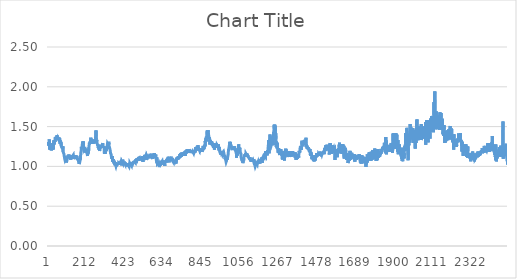
| Category | Series 0 |
|---|---|
| 0 | 1.258 |
| 1 | 1.306 |
| 2 | 1.29 |
| 3 | 1.264 |
| 4 | 1.274 |
| 5 | 1.293 |
| 6 | 1.276 |
| 7 | 1.338 |
| 8 | 1.216 |
| 9 | 1.26 |
| 10 | 1.258 |
| 11 | 1.273 |
| 12 | 1.21 |
| 13 | 1.226 |
| 14 | 1.241 |
| 15 | 1.23 |
| 16 | 1.204 |
| 17 | 1.199 |
| 18 | 1.233 |
| 19 | 1.203 |
| 20 | 1.224 |
| 21 | 1.241 |
| 22 | 1.24 |
| 23 | 1.215 |
| 24 | 1.238 |
| 25 | 1.216 |
| 26 | 1.293 |
| 27 | 1.292 |
| 28 | 1.214 |
| 29 | 1.281 |
| 30 | 1.264 |
| 31 | 1.312 |
| 32 | 1.328 |
| 33 | 1.277 |
| 34 | 1.285 |
| 35 | 1.303 |
| 36 | 1.326 |
| 37 | 1.324 |
| 38 | 1.307 |
| 39 | 1.301 |
| 40 | 1.37 |
| 41 | 1.349 |
| 42 | 1.36 |
| 43 | 1.352 |
| 44 | 1.347 |
| 45 | 1.338 |
| 46 | 1.359 |
| 47 | 1.367 |
| 48 | 1.391 |
| 49 | 1.373 |
| 50 | 1.371 |
| 51 | 1.34 |
| 52 | 1.33 |
| 53 | 1.346 |
| 54 | 1.366 |
| 55 | 1.328 |
| 56 | 1.353 |
| 57 | 1.347 |
| 58 | 1.352 |
| 59 | 1.355 |
| 60 | 1.349 |
| 61 | 1.332 |
| 62 | 1.307 |
| 63 | 1.36 |
| 64 | 1.311 |
| 65 | 1.33 |
| 66 | 1.283 |
| 67 | 1.313 |
| 68 | 1.31 |
| 69 | 1.294 |
| 70 | 1.306 |
| 71 | 1.309 |
| 72 | 1.259 |
| 73 | 1.266 |
| 74 | 1.263 |
| 75 | 1.266 |
| 76 | 1.252 |
| 77 | 1.232 |
| 78 | 1.231 |
| 79 | 1.218 |
| 80 | 1.236 |
| 81 | 1.253 |
| 82 | 1.185 |
| 83 | 1.196 |
| 84 | 1.188 |
| 85 | 1.195 |
| 86 | 1.185 |
| 87 | 1.154 |
| 88 | 1.132 |
| 89 | 1.13 |
| 90 | 1.108 |
| 91 | 1.092 |
| 92 | 1.081 |
| 93 | 1.075 |
| 94 | 1.086 |
| 95 | 1.086 |
| 96 | 1.088 |
| 97 | 1.072 |
| 98 | 1.105 |
| 99 | 1.069 |
| 100 | 1.049 |
| 101 | 1.056 |
| 102 | 1.057 |
| 103 | 1.079 |
| 104 | 1.09 |
| 105 | 1.082 |
| 106 | 1.108 |
| 107 | 1.115 |
| 108 | 1.119 |
| 109 | 1.112 |
| 110 | 1.136 |
| 111 | 1.128 |
| 112 | 1.102 |
| 113 | 1.148 |
| 114 | 1.14 |
| 115 | 1.128 |
| 116 | 1.143 |
| 117 | 1.127 |
| 118 | 1.132 |
| 119 | 1.114 |
| 120 | 1.133 |
| 121 | 1.124 |
| 122 | 1.121 |
| 123 | 1.129 |
| 124 | 1.085 |
| 125 | 1.113 |
| 126 | 1.125 |
| 127 | 1.132 |
| 128 | 1.099 |
| 129 | 1.122 |
| 130 | 1.139 |
| 131 | 1.123 |
| 132 | 1.127 |
| 133 | 1.097 |
| 134 | 1.129 |
| 135 | 1.135 |
| 136 | 1.126 |
| 137 | 1.122 |
| 138 | 1.143 |
| 139 | 1.122 |
| 140 | 1.092 |
| 141 | 1.095 |
| 142 | 1.099 |
| 143 | 1.102 |
| 144 | 1.09 |
| 145 | 1.131 |
| 146 | 1.095 |
| 147 | 1.106 |
| 148 | 1.092 |
| 149 | 1.133 |
| 150 | 1.1 |
| 151 | 1.121 |
| 152 | 1.143 |
| 153 | 1.106 |
| 154 | 1.122 |
| 155 | 1.116 |
| 156 | 1.107 |
| 157 | 1.13 |
| 158 | 1.132 |
| 159 | 1.105 |
| 160 | 1.108 |
| 161 | 1.079 |
| 162 | 1.104 |
| 163 | 1.095 |
| 164 | 1.084 |
| 165 | 1.084 |
| 166 | 1.079 |
| 167 | 1.084 |
| 168 | 1.056 |
| 169 | 1.073 |
| 170 | 1.03 |
| 171 | 1.018 |
| 172 | 1.029 |
| 173 | 1.052 |
| 174 | 1.046 |
| 175 | 1.074 |
| 176 | 1.077 |
| 177 | 1.09 |
| 178 | 1.14 |
| 179 | 1.17 |
| 180 | 1.169 |
| 181 | 1.197 |
| 182 | 1.245 |
| 183 | 1.217 |
| 184 | 1.219 |
| 185 | 1.234 |
| 186 | 1.229 |
| 187 | 1.274 |
| 188 | 1.287 |
| 189 | 1.311 |
| 190 | 1.293 |
| 191 | 1.303 |
| 192 | 1.264 |
| 193 | 1.313 |
| 194 | 1.265 |
| 195 | 1.271 |
| 196 | 1.212 |
| 197 | 1.221 |
| 198 | 1.224 |
| 199 | 1.225 |
| 200 | 1.243 |
| 201 | 1.248 |
| 202 | 1.218 |
| 203 | 1.229 |
| 204 | 1.193 |
| 205 | 1.222 |
| 206 | 1.173 |
| 207 | 1.185 |
| 208 | 1.21 |
| 209 | 1.198 |
| 210 | 1.191 |
| 211 | 1.177 |
| 212 | 1.182 |
| 213 | 1.184 |
| 214 | 1.155 |
| 215 | 1.157 |
| 216 | 1.131 |
| 217 | 1.175 |
| 218 | 1.192 |
| 219 | 1.161 |
| 220 | 1.216 |
| 221 | 1.212 |
| 222 | 1.198 |
| 223 | 1.238 |
| 224 | 1.227 |
| 225 | 1.249 |
| 226 | 1.297 |
| 227 | 1.279 |
| 228 | 1.28 |
| 229 | 1.3 |
| 230 | 1.315 |
| 231 | 1.312 |
| 232 | 1.295 |
| 233 | 1.329 |
| 234 | 1.361 |
| 235 | 1.314 |
| 236 | 1.31 |
| 237 | 1.303 |
| 238 | 1.288 |
| 239 | 1.34 |
| 240 | 1.332 |
| 241 | 1.284 |
| 242 | 1.321 |
| 243 | 1.313 |
| 244 | 1.29 |
| 245 | 1.329 |
| 246 | 1.326 |
| 247 | 1.291 |
| 248 | 1.318 |
| 249 | 1.321 |
| 250 | 1.323 |
| 251 | 1.337 |
| 252 | 1.311 |
| 253 | 1.325 |
| 254 | 1.325 |
| 255 | 1.331 |
| 256 | 1.332 |
| 257 | 1.318 |
| 258 | 1.29 |
| 259 | 1.344 |
| 260 | 1.331 |
| 261 | 1.305 |
| 262 | 1.45 |
| 263 | 1.343 |
| 264 | 1.318 |
| 265 | 1.293 |
| 266 | 1.334 |
| 267 | 1.308 |
| 268 | 1.291 |
| 269 | 1.281 |
| 270 | 1.278 |
| 271 | 1.288 |
| 272 | 1.278 |
| 273 | 1.258 |
| 274 | 1.273 |
| 275 | 1.233 |
| 276 | 1.266 |
| 277 | 1.228 |
| 278 | 1.21 |
| 279 | 1.22 |
| 280 | 1.242 |
| 281 | 1.223 |
| 282 | 1.193 |
| 283 | 1.215 |
| 284 | 1.207 |
| 285 | 1.227 |
| 286 | 1.204 |
| 287 | 1.232 |
| 288 | 1.229 |
| 289 | 1.271 |
| 290 | 1.235 |
| 291 | 1.259 |
| 292 | 1.269 |
| 293 | 1.246 |
| 294 | 1.268 |
| 295 | 1.242 |
| 296 | 1.272 |
| 297 | 1.271 |
| 298 | 1.279 |
| 299 | 1.293 |
| 300 | 1.277 |
| 301 | 1.278 |
| 302 | 1.276 |
| 303 | 1.231 |
| 304 | 1.239 |
| 305 | 1.253 |
| 306 | 1.244 |
| 307 | 1.235 |
| 308 | 1.16 |
| 309 | 1.209 |
| 310 | 1.224 |
| 311 | 1.183 |
| 312 | 1.156 |
| 313 | 1.205 |
| 314 | 1.179 |
| 315 | 1.183 |
| 316 | 1.199 |
| 317 | 1.188 |
| 318 | 1.232 |
| 319 | 1.197 |
| 320 | 1.247 |
| 321 | 1.24 |
| 322 | 1.222 |
| 323 | 1.245 |
| 324 | 1.257 |
| 325 | 1.285 |
| 326 | 1.279 |
| 327 | 1.293 |
| 328 | 1.272 |
| 329 | 1.3 |
| 330 | 1.244 |
| 331 | 1.258 |
| 332 | 1.31 |
| 333 | 1.281 |
| 334 | 1.255 |
| 335 | 1.266 |
| 336 | 1.25 |
| 337 | 1.26 |
| 338 | 1.25 |
| 339 | 1.211 |
| 340 | 1.22 |
| 341 | 1.211 |
| 342 | 1.165 |
| 343 | 1.167 |
| 344 | 1.158 |
| 345 | 1.149 |
| 346 | 1.156 |
| 347 | 1.114 |
| 348 | 1.129 |
| 349 | 1.097 |
| 350 | 1.091 |
| 351 | 1.131 |
| 352 | 1.081 |
| 353 | 1.087 |
| 354 | 1.058 |
| 355 | 1.077 |
| 356 | 1.06 |
| 357 | 1.089 |
| 358 | 1.073 |
| 359 | 1.051 |
| 360 | 1.07 |
| 361 | 1.039 |
| 362 | 1.069 |
| 363 | 1.05 |
| 364 | 1.034 |
| 365 | 1.026 |
| 366 | 1.015 |
| 367 | 1.055 |
| 368 | 1.026 |
| 369 | 1.028 |
| 370 | 1.015 |
| 371 | 1.004 |
| 372 | 1.01 |
| 373 | 0.997 |
| 374 | 1.033 |
| 375 | 1.01 |
| 376 | 0.999 |
| 377 | 0.998 |
| 378 | 1.009 |
| 379 | 1.001 |
| 380 | 1.009 |
| 381 | 1.027 |
| 382 | 1.026 |
| 383 | 1.031 |
| 384 | 1.043 |
| 385 | 1.021 |
| 386 | 1.044 |
| 387 | 1.041 |
| 388 | 1.045 |
| 389 | 1.042 |
| 390 | 1.04 |
| 391 | 1.044 |
| 392 | 1.033 |
| 393 | 1.019 |
| 394 | 1.049 |
| 395 | 1.053 |
| 396 | 1.04 |
| 397 | 1.039 |
| 398 | 1.063 |
| 399 | 1.043 |
| 400 | 1.021 |
| 401 | 1.041 |
| 402 | 1.043 |
| 403 | 1.013 |
| 404 | 1.059 |
| 405 | 1.064 |
| 406 | 1.049 |
| 407 | 1.055 |
| 408 | 1.043 |
| 409 | 1.085 |
| 410 | 1.029 |
| 411 | 1.051 |
| 412 | 1.048 |
| 413 | 1.036 |
| 414 | 1.022 |
| 415 | 1.045 |
| 416 | 1.026 |
| 417 | 1.058 |
| 418 | 1.058 |
| 419 | 1.041 |
| 420 | 1.031 |
| 421 | 1.035 |
| 422 | 1.027 |
| 423 | 1.047 |
| 424 | 1.035 |
| 425 | 1.044 |
| 426 | 1.02 |
| 427 | 1.039 |
| 428 | 1.029 |
| 429 | 1 |
| 430 | 1.025 |
| 431 | 1.01 |
| 432 | 1.04 |
| 433 | 1.036 |
| 434 | 1.031 |
| 435 | 1.014 |
| 436 | 1.036 |
| 437 | 1.032 |
| 438 | 1.027 |
| 439 | 1.012 |
| 440 | 1.009 |
| 441 | 1.021 |
| 442 | 1.013 |
| 443 | 0.997 |
| 444 | 1 |
| 445 | 1.024 |
| 446 | 1.01 |
| 447 | 1.041 |
| 448 | 1.031 |
| 449 | 1.05 |
| 450 | 1.027 |
| 451 | 1.023 |
| 452 | 1.039 |
| 453 | 1.021 |
| 454 | 1.035 |
| 455 | 1.01 |
| 456 | 1.04 |
| 457 | 1.055 |
| 458 | 1.05 |
| 459 | 1.047 |
| 460 | 1.033 |
| 461 | 1.031 |
| 462 | 1.054 |
| 463 | 1.056 |
| 464 | 1.036 |
| 465 | 1.042 |
| 466 | 1.042 |
| 467 | 1.054 |
| 468 | 1.042 |
| 469 | 1.051 |
| 470 | 1.043 |
| 471 | 1.056 |
| 472 | 1.065 |
| 473 | 1.062 |
| 474 | 1.051 |
| 475 | 1.072 |
| 476 | 1.05 |
| 477 | 1.066 |
| 478 | 1.047 |
| 479 | 1.064 |
| 480 | 1.087 |
| 481 | 1.046 |
| 482 | 1.088 |
| 483 | 1.098 |
| 484 | 1.069 |
| 485 | 1.084 |
| 486 | 1.104 |
| 487 | 1.097 |
| 488 | 1.089 |
| 489 | 1.089 |
| 490 | 1.103 |
| 491 | 1.083 |
| 492 | 1.09 |
| 493 | 1.099 |
| 494 | 1.068 |
| 495 | 1.106 |
| 496 | 1.112 |
| 497 | 1.096 |
| 498 | 1.102 |
| 499 | 1.109 |
| 500 | 1.109 |
| 501 | 1.113 |
| 502 | 1.124 |
| 503 | 1.107 |
| 504 | 1.096 |
| 505 | 1.077 |
| 506 | 1.093 |
| 507 | 1.109 |
| 508 | 1.113 |
| 509 | 1.096 |
| 510 | 1.095 |
| 511 | 1.099 |
| 512 | 1.076 |
| 513 | 1.086 |
| 514 | 1.11 |
| 515 | 1.096 |
| 516 | 1.08 |
| 517 | 1.129 |
| 518 | 1.105 |
| 519 | 1.056 |
| 520 | 1.108 |
| 521 | 1.112 |
| 522 | 1.094 |
| 523 | 1.08 |
| 524 | 1.075 |
| 525 | 1.079 |
| 526 | 1.073 |
| 527 | 1.115 |
| 528 | 1.145 |
| 529 | 1.107 |
| 530 | 1.105 |
| 531 | 1.102 |
| 532 | 1.119 |
| 533 | 1.116 |
| 534 | 1.132 |
| 535 | 1.114 |
| 536 | 1.088 |
| 537 | 1.125 |
| 538 | 1.106 |
| 539 | 1.127 |
| 540 | 1.085 |
| 541 | 1.133 |
| 542 | 1.129 |
| 543 | 1.122 |
| 544 | 1.12 |
| 545 | 1.13 |
| 546 | 1.122 |
| 547 | 1.142 |
| 548 | 1.119 |
| 549 | 1.132 |
| 550 | 1.113 |
| 551 | 1.142 |
| 552 | 1.148 |
| 553 | 1.135 |
| 554 | 1.109 |
| 555 | 1.131 |
| 556 | 1.127 |
| 557 | 1.102 |
| 558 | 1.158 |
| 559 | 1.147 |
| 560 | 1.145 |
| 561 | 1.127 |
| 562 | 1.142 |
| 563 | 1.124 |
| 564 | 1.14 |
| 565 | 1.131 |
| 566 | 1.127 |
| 567 | 1.118 |
| 568 | 1.121 |
| 569 | 1.118 |
| 570 | 1.132 |
| 571 | 1.137 |
| 572 | 1.092 |
| 573 | 1.151 |
| 574 | 1.136 |
| 575 | 1.118 |
| 576 | 1.14 |
| 577 | 1.109 |
| 578 | 1.141 |
| 579 | 1.16 |
| 580 | 1.14 |
| 581 | 1.166 |
| 582 | 1.161 |
| 583 | 1.131 |
| 584 | 1.122 |
| 585 | 1.135 |
| 586 | 1.104 |
| 587 | 1.1 |
| 588 | 1.111 |
| 589 | 1.148 |
| 590 | 1.11 |
| 591 | 1.12 |
| 592 | 1.09 |
| 593 | 1.061 |
| 594 | 1.06 |
| 595 | 1.114 |
| 596 | 1.042 |
| 597 | 1.055 |
| 598 | 1.032 |
| 599 | 1.03 |
| 600 | 1.026 |
| 601 | 1.034 |
| 602 | 1.034 |
| 603 | 1.025 |
| 604 | 1.047 |
| 605 | 1.016 |
| 606 | 1.03 |
| 607 | 1.015 |
| 608 | 1.012 |
| 609 | 0.991 |
| 610 | 1.001 |
| 611 | 1.027 |
| 612 | 1.021 |
| 613 | 1.008 |
| 614 | 1.031 |
| 615 | 1.021 |
| 616 | 1.027 |
| 617 | 1.05 |
| 618 | 1.021 |
| 619 | 1.07 |
| 620 | 1.052 |
| 621 | 1.043 |
| 622 | 1.059 |
| 623 | 1.042 |
| 624 | 1.066 |
| 625 | 1.051 |
| 626 | 1.071 |
| 627 | 1.054 |
| 628 | 1.067 |
| 629 | 1.075 |
| 630 | 1.026 |
| 631 | 1.043 |
| 632 | 1.074 |
| 633 | 1.033 |
| 634 | 1.029 |
| 635 | 1.032 |
| 636 | 1.032 |
| 637 | 1.057 |
| 638 | 1.007 |
| 639 | 1.035 |
| 640 | 1.039 |
| 641 | 1.052 |
| 642 | 1.05 |
| 643 | 1.058 |
| 644 | 1.049 |
| 645 | 1.061 |
| 646 | 1.05 |
| 647 | 1.075 |
| 648 | 1.053 |
| 649 | 1.068 |
| 650 | 1.084 |
| 651 | 1.068 |
| 652 | 1.069 |
| 653 | 1.052 |
| 654 | 1.095 |
| 655 | 1.079 |
| 656 | 1.068 |
| 657 | 1.09 |
| 658 | 1.106 |
| 659 | 1.111 |
| 660 | 1.084 |
| 661 | 1.12 |
| 662 | 1.051 |
| 663 | 1.097 |
| 664 | 1.101 |
| 665 | 1.118 |
| 666 | 1.101 |
| 667 | 1.104 |
| 668 | 1.086 |
| 669 | 1.093 |
| 670 | 1.106 |
| 671 | 1.07 |
| 672 | 1.121 |
| 673 | 1.113 |
| 674 | 1.088 |
| 675 | 1.094 |
| 676 | 1.105 |
| 677 | 1.075 |
| 678 | 1.083 |
| 679 | 1.1 |
| 680 | 1.098 |
| 681 | 1.088 |
| 682 | 1.064 |
| 683 | 1.069 |
| 684 | 1.072 |
| 685 | 1.072 |
| 686 | 1.055 |
| 687 | 1.047 |
| 688 | 1.054 |
| 689 | 1.071 |
| 690 | 1.065 |
| 691 | 1.063 |
| 692 | 1.071 |
| 693 | 1.064 |
| 694 | 1.057 |
| 695 | 1.068 |
| 696 | 1.046 |
| 697 | 1.077 |
| 698 | 1.087 |
| 699 | 1.085 |
| 700 | 1.036 |
| 701 | 1.068 |
| 702 | 1.09 |
| 703 | 1.071 |
| 704 | 1.107 |
| 705 | 1.09 |
| 706 | 1.11 |
| 707 | 1.088 |
| 708 | 1.093 |
| 709 | 1.103 |
| 710 | 1.089 |
| 711 | 1.096 |
| 712 | 1.126 |
| 713 | 1.121 |
| 714 | 1.092 |
| 715 | 1.097 |
| 716 | 1.109 |
| 717 | 1.127 |
| 718 | 1.106 |
| 719 | 1.123 |
| 720 | 1.129 |
| 721 | 1.153 |
| 722 | 1.129 |
| 723 | 1.126 |
| 724 | 1.116 |
| 725 | 1.15 |
| 726 | 1.168 |
| 727 | 1.121 |
| 728 | 1.155 |
| 729 | 1.144 |
| 730 | 1.12 |
| 731 | 1.161 |
| 732 | 1.176 |
| 733 | 1.145 |
| 734 | 1.157 |
| 735 | 1.157 |
| 736 | 1.147 |
| 737 | 1.148 |
| 738 | 1.138 |
| 739 | 1.16 |
| 740 | 1.132 |
| 741 | 1.159 |
| 742 | 1.162 |
| 743 | 1.14 |
| 744 | 1.158 |
| 745 | 1.144 |
| 746 | 1.162 |
| 747 | 1.163 |
| 748 | 1.178 |
| 749 | 1.167 |
| 750 | 1.133 |
| 751 | 1.167 |
| 752 | 1.182 |
| 753 | 1.199 |
| 754 | 1.185 |
| 755 | 1.187 |
| 756 | 1.164 |
| 757 | 1.169 |
| 758 | 1.179 |
| 759 | 1.211 |
| 760 | 1.19 |
| 761 | 1.202 |
| 762 | 1.187 |
| 763 | 1.212 |
| 764 | 1.197 |
| 765 | 1.196 |
| 766 | 1.189 |
| 767 | 1.169 |
| 768 | 1.208 |
| 769 | 1.199 |
| 770 | 1.188 |
| 771 | 1.213 |
| 772 | 1.202 |
| 773 | 1.221 |
| 774 | 1.209 |
| 775 | 1.191 |
| 776 | 1.19 |
| 777 | 1.186 |
| 778 | 1.17 |
| 779 | 1.179 |
| 780 | 1.195 |
| 781 | 1.174 |
| 782 | 1.183 |
| 783 | 1.182 |
| 784 | 1.185 |
| 785 | 1.181 |
| 786 | 1.186 |
| 787 | 1.206 |
| 788 | 1.166 |
| 789 | 1.172 |
| 790 | 1.174 |
| 791 | 1.162 |
| 792 | 1.188 |
| 793 | 1.183 |
| 794 | 1.191 |
| 795 | 1.174 |
| 796 | 1.191 |
| 797 | 1.17 |
| 798 | 1.2 |
| 799 | 1.191 |
| 800 | 1.19 |
| 801 | 1.182 |
| 802 | 1.194 |
| 803 | 1.184 |
| 804 | 1.196 |
| 805 | 1.177 |
| 806 | 1.207 |
| 807 | 1.214 |
| 808 | 1.243 |
| 809 | 1.202 |
| 810 | 1.219 |
| 811 | 1.219 |
| 812 | 1.211 |
| 813 | 1.237 |
| 814 | 1.202 |
| 815 | 1.224 |
| 816 | 1.241 |
| 817 | 1.218 |
| 818 | 1.203 |
| 819 | 1.251 |
| 820 | 1.267 |
| 821 | 1.219 |
| 822 | 1.245 |
| 823 | 1.231 |
| 824 | 1.223 |
| 825 | 1.221 |
| 826 | 1.237 |
| 827 | 1.224 |
| 828 | 1.206 |
| 829 | 1.227 |
| 830 | 1.237 |
| 831 | 1.209 |
| 832 | 1.195 |
| 833 | 1.207 |
| 834 | 1.201 |
| 835 | 1.186 |
| 836 | 1.208 |
| 837 | 1.223 |
| 838 | 1.209 |
| 839 | 1.189 |
| 840 | 1.216 |
| 841 | 1.229 |
| 842 | 1.205 |
| 843 | 1.181 |
| 844 | 1.186 |
| 845 | 1.223 |
| 846 | 1.202 |
| 847 | 1.202 |
| 848 | 1.209 |
| 849 | 1.257 |
| 850 | 1.268 |
| 851 | 1.213 |
| 852 | 1.239 |
| 853 | 1.234 |
| 854 | 1.225 |
| 855 | 1.238 |
| 856 | 1.248 |
| 857 | 1.273 |
| 858 | 1.263 |
| 859 | 1.251 |
| 860 | 1.32 |
| 861 | 1.294 |
| 862 | 1.3 |
| 863 | 1.328 |
| 864 | 1.355 |
| 865 | 1.315 |
| 866 | 1.371 |
| 867 | 1.359 |
| 868 | 1.356 |
| 869 | 1.358 |
| 870 | 1.356 |
| 871 | 1.449 |
| 872 | 1.395 |
| 873 | 1.393 |
| 874 | 1.402 |
| 875 | 1.455 |
| 876 | 1.446 |
| 877 | 1.427 |
| 878 | 1.402 |
| 879 | 1.395 |
| 880 | 1.372 |
| 881 | 1.379 |
| 882 | 1.34 |
| 883 | 1.364 |
| 884 | 1.343 |
| 885 | 1.276 |
| 886 | 1.332 |
| 887 | 1.307 |
| 888 | 1.323 |
| 889 | 1.312 |
| 890 | 1.322 |
| 891 | 1.289 |
| 892 | 1.314 |
| 893 | 1.319 |
| 894 | 1.296 |
| 895 | 1.303 |
| 896 | 1.313 |
| 897 | 1.267 |
| 898 | 1.29 |
| 899 | 1.277 |
| 900 | 1.256 |
| 901 | 1.248 |
| 902 | 1.276 |
| 903 | 1.276 |
| 904 | 1.265 |
| 905 | 1.234 |
| 906 | 1.253 |
| 907 | 1.29 |
| 908 | 1.246 |
| 909 | 1.254 |
| 910 | 1.21 |
| 911 | 1.226 |
| 912 | 1.27 |
| 913 | 1.234 |
| 914 | 1.26 |
| 915 | 1.246 |
| 916 | 1.231 |
| 917 | 1.263 |
| 918 | 1.282 |
| 919 | 1.257 |
| 920 | 1.287 |
| 921 | 1.279 |
| 922 | 1.245 |
| 923 | 1.265 |
| 924 | 1.232 |
| 925 | 1.267 |
| 926 | 1.272 |
| 927 | 1.267 |
| 928 | 1.266 |
| 929 | 1.277 |
| 930 | 1.248 |
| 931 | 1.26 |
| 932 | 1.277 |
| 933 | 1.261 |
| 934 | 1.257 |
| 935 | 1.2 |
| 936 | 1.238 |
| 937 | 1.217 |
| 938 | 1.236 |
| 939 | 1.188 |
| 940 | 1.187 |
| 941 | 1.185 |
| 942 | 1.167 |
| 943 | 1.156 |
| 944 | 1.153 |
| 945 | 1.183 |
| 946 | 1.159 |
| 947 | 1.145 |
| 948 | 1.135 |
| 949 | 1.149 |
| 950 | 1.193 |
| 951 | 1.163 |
| 952 | 1.162 |
| 953 | 1.167 |
| 954 | 1.157 |
| 955 | 1.164 |
| 956 | 1.177 |
| 957 | 1.155 |
| 958 | 1.162 |
| 959 | 1.156 |
| 960 | 1.153 |
| 961 | 1.173 |
| 962 | 1.161 |
| 963 | 1.151 |
| 964 | 1.12 |
| 965 | 1.121 |
| 966 | 1.144 |
| 967 | 1.125 |
| 968 | 1.092 |
| 969 | 1.104 |
| 970 | 1.112 |
| 971 | 1.087 |
| 972 | 1.078 |
| 973 | 1.086 |
| 974 | 1.056 |
| 975 | 1.06 |
| 976 | 1.069 |
| 977 | 1.08 |
| 978 | 1.06 |
| 979 | 1.123 |
| 980 | 1.086 |
| 981 | 1.09 |
| 982 | 1.108 |
| 983 | 1.116 |
| 984 | 1.109 |
| 985 | 1.146 |
| 986 | 1.166 |
| 987 | 1.209 |
| 988 | 1.205 |
| 989 | 1.208 |
| 990 | 1.232 |
| 991 | 1.254 |
| 992 | 1.243 |
| 993 | 1.277 |
| 994 | 1.31 |
| 995 | 1.306 |
| 996 | 1.272 |
| 997 | 1.306 |
| 998 | 1.282 |
| 999 | 1.272 |
| 1000 | 1.29 |
| 1001 | 1.286 |
| 1002 | 1.262 |
| 1003 | 1.237 |
| 1004 | 1.241 |
| 1005 | 1.248 |
| 1006 | 1.229 |
| 1007 | 1.205 |
| 1008 | 1.224 |
| 1009 | 1.215 |
| 1010 | 1.208 |
| 1011 | 1.24 |
| 1012 | 1.246 |
| 1013 | 1.231 |
| 1014 | 1.215 |
| 1015 | 1.249 |
| 1016 | 1.22 |
| 1017 | 1.217 |
| 1018 | 1.223 |
| 1019 | 1.252 |
| 1020 | 1.236 |
| 1021 | 1.246 |
| 1022 | 1.209 |
| 1023 | 1.228 |
| 1024 | 1.208 |
| 1025 | 1.201 |
| 1026 | 1.2 |
| 1027 | 1.217 |
| 1028 | 1.189 |
| 1029 | 1.206 |
| 1030 | 1.173 |
| 1031 | 1.11 |
| 1032 | 1.204 |
| 1033 | 1.192 |
| 1034 | 1.189 |
| 1035 | 1.135 |
| 1036 | 1.178 |
| 1037 | 1.189 |
| 1038 | 1.185 |
| 1039 | 1.199 |
| 1040 | 1.235 |
| 1041 | 1.226 |
| 1042 | 1.224 |
| 1043 | 1.277 |
| 1044 | 1.233 |
| 1045 | 1.235 |
| 1046 | 1.223 |
| 1047 | 1.214 |
| 1048 | 1.221 |
| 1049 | 1.236 |
| 1050 | 1.211 |
| 1051 | 1.198 |
| 1052 | 1.175 |
| 1053 | 1.184 |
| 1054 | 1.175 |
| 1055 | 1.16 |
| 1056 | 1.117 |
| 1057 | 1.129 |
| 1058 | 1.107 |
| 1059 | 1.089 |
| 1060 | 1.107 |
| 1061 | 1.081 |
| 1062 | 1.064 |
| 1063 | 1.08 |
| 1064 | 1.077 |
| 1065 | 1.062 |
| 1066 | 1.041 |
| 1067 | 1.042 |
| 1068 | 1.07 |
| 1069 | 1.094 |
| 1070 | 1.076 |
| 1071 | 1.108 |
| 1072 | 1.109 |
| 1073 | 1.108 |
| 1074 | 1.148 |
| 1075 | 1.124 |
| 1076 | 1.126 |
| 1077 | 1.135 |
| 1078 | 1.144 |
| 1079 | 1.127 |
| 1080 | 1.163 |
| 1081 | 1.131 |
| 1082 | 1.161 |
| 1083 | 1.159 |
| 1084 | 1.153 |
| 1085 | 1.148 |
| 1086 | 1.13 |
| 1087 | 1.164 |
| 1088 | 1.167 |
| 1089 | 1.139 |
| 1090 | 1.152 |
| 1091 | 1.145 |
| 1092 | 1.123 |
| 1093 | 1.138 |
| 1094 | 1.128 |
| 1095 | 1.119 |
| 1096 | 1.11 |
| 1097 | 1.124 |
| 1098 | 1.109 |
| 1099 | 1.131 |
| 1100 | 1.113 |
| 1101 | 1.1 |
| 1102 | 1.094 |
| 1103 | 1.087 |
| 1104 | 1.116 |
| 1105 | 1.098 |
| 1106 | 1.095 |
| 1107 | 1.097 |
| 1108 | 1.065 |
| 1109 | 1.081 |
| 1110 | 1.093 |
| 1111 | 1.092 |
| 1112 | 1.059 |
| 1113 | 1.077 |
| 1114 | 1.074 |
| 1115 | 1.088 |
| 1116 | 1.074 |
| 1117 | 1.072 |
| 1118 | 1.07 |
| 1119 | 1.089 |
| 1120 | 1.076 |
| 1121 | 1.08 |
| 1122 | 1.09 |
| 1123 | 1.055 |
| 1124 | 1.091 |
| 1125 | 1.06 |
| 1126 | 1.061 |
| 1127 | 1.063 |
| 1128 | 1.034 |
| 1129 | 1.029 |
| 1130 | 1.029 |
| 1131 | 1.017 |
| 1132 | 1.028 |
| 1133 | 0.999 |
| 1134 | 1.01 |
| 1135 | 1.012 |
| 1136 | 1.025 |
| 1137 | 1.031 |
| 1138 | 1.022 |
| 1139 | 1.009 |
| 1140 | 1.038 |
| 1141 | 1.045 |
| 1142 | 1.03 |
| 1143 | 1.026 |
| 1144 | 1.023 |
| 1145 | 1.039 |
| 1146 | 1.052 |
| 1147 | 1.037 |
| 1148 | 1.049 |
| 1149 | 1.059 |
| 1150 | 1.04 |
| 1151 | 1.082 |
| 1152 | 1.043 |
| 1153 | 1.058 |
| 1154 | 1.063 |
| 1155 | 1.05 |
| 1156 | 1.062 |
| 1157 | 1.037 |
| 1158 | 1.059 |
| 1159 | 1.049 |
| 1160 | 1.085 |
| 1161 | 1.039 |
| 1162 | 1.086 |
| 1163 | 1.048 |
| 1164 | 1.056 |
| 1165 | 1.066 |
| 1166 | 1.059 |
| 1167 | 1.1 |
| 1168 | 1.076 |
| 1169 | 1.09 |
| 1170 | 1.083 |
| 1171 | 1.115 |
| 1172 | 1.044 |
| 1173 | 1.074 |
| 1174 | 1.087 |
| 1175 | 1.112 |
| 1176 | 1.122 |
| 1177 | 1.119 |
| 1178 | 1.105 |
| 1179 | 1.132 |
| 1180 | 1.128 |
| 1181 | 1.143 |
| 1182 | 1.137 |
| 1183 | 1.117 |
| 1184 | 1.132 |
| 1185 | 1.124 |
| 1186 | 1.127 |
| 1187 | 1.146 |
| 1188 | 1.139 |
| 1189 | 1.147 |
| 1190 | 1.133 |
| 1191 | 1.187 |
| 1192 | 1.158 |
| 1193 | 1.192 |
| 1194 | 1.176 |
| 1195 | 1.158 |
| 1196 | 1.166 |
| 1197 | 1.16 |
| 1198 | 1.166 |
| 1199 | 1.138 |
| 1200 | 1.2 |
| 1201 | 1.196 |
| 1202 | 1.186 |
| 1203 | 1.205 |
| 1204 | 1.192 |
| 1205 | 1.239 |
| 1206 | 1.332 |
| 1207 | 1.202 |
| 1208 | 1.215 |
| 1209 | 1.164 |
| 1210 | 1.25 |
| 1211 | 1.258 |
| 1212 | 1.253 |
| 1213 | 1.279 |
| 1214 | 1.4 |
| 1215 | 1.31 |
| 1216 | 1.281 |
| 1217 | 1.298 |
| 1218 | 1.306 |
| 1219 | 1.299 |
| 1220 | 1.289 |
| 1221 | 1.266 |
| 1222 | 1.275 |
| 1223 | 1.256 |
| 1224 | 1.291 |
| 1225 | 1.327 |
| 1226 | 1.292 |
| 1227 | 1.366 |
| 1228 | 1.302 |
| 1229 | 1.34 |
| 1230 | 1.375 |
| 1231 | 1.333 |
| 1232 | 1.266 |
| 1233 | 1.433 |
| 1234 | 1.39 |
| 1235 | 1.427 |
| 1236 | 1.478 |
| 1237 | 1.523 |
| 1238 | 1.479 |
| 1239 | 1.458 |
| 1240 | 1.524 |
| 1241 | 1.423 |
| 1242 | 1.509 |
| 1243 | 1.447 |
| 1244 | 1.441 |
| 1245 | 1.401 |
| 1246 | 1.416 |
| 1247 | 1.346 |
| 1248 | 1.357 |
| 1249 | 1.243 |
| 1250 | 1.311 |
| 1251 | 1.304 |
| 1252 | 1.25 |
| 1253 | 1.227 |
| 1254 | 1.296 |
| 1255 | 1.261 |
| 1256 | 1.22 |
| 1257 | 1.209 |
| 1258 | 1.2 |
| 1259 | 1.17 |
| 1260 | 1.214 |
| 1261 | 1.206 |
| 1262 | 1.231 |
| 1263 | 1.169 |
| 1264 | 1.197 |
| 1265 | 1.176 |
| 1266 | 1.142 |
| 1267 | 1.147 |
| 1268 | 1.204 |
| 1269 | 1.192 |
| 1270 | 1.217 |
| 1271 | 1.169 |
| 1272 | 1.188 |
| 1273 | 1.199 |
| 1274 | 1.216 |
| 1275 | 1.149 |
| 1276 | 1.155 |
| 1277 | 1.174 |
| 1278 | 1.154 |
| 1279 | 1.182 |
| 1280 | 1.135 |
| 1281 | 1.157 |
| 1282 | 1.088 |
| 1283 | 1.194 |
| 1284 | 1.147 |
| 1285 | 1.134 |
| 1286 | 1.171 |
| 1287 | 1.108 |
| 1288 | 1.128 |
| 1289 | 1.129 |
| 1290 | 1.127 |
| 1291 | 1.158 |
| 1292 | 1.125 |
| 1293 | 1.116 |
| 1294 | 1.073 |
| 1295 | 1.189 |
| 1296 | 1.136 |
| 1297 | 1.171 |
| 1298 | 1.165 |
| 1299 | 1.222 |
| 1300 | 1.133 |
| 1301 | 1.192 |
| 1302 | 1.22 |
| 1303 | 1.195 |
| 1304 | 1.173 |
| 1305 | 1.152 |
| 1306 | 1.164 |
| 1307 | 1.168 |
| 1308 | 1.124 |
| 1309 | 1.138 |
| 1310 | 1.146 |
| 1311 | 1.164 |
| 1312 | 1.147 |
| 1313 | 1.183 |
| 1314 | 1.128 |
| 1315 | 1.126 |
| 1316 | 1.153 |
| 1317 | 1.131 |
| 1318 | 1.117 |
| 1319 | 1.193 |
| 1320 | 1.137 |
| 1321 | 1.17 |
| 1322 | 1.127 |
| 1323 | 1.13 |
| 1324 | 1.146 |
| 1325 | 1.168 |
| 1326 | 1.136 |
| 1327 | 1.133 |
| 1328 | 1.155 |
| 1329 | 1.16 |
| 1330 | 1.152 |
| 1331 | 1.158 |
| 1332 | 1.187 |
| 1333 | 1.193 |
| 1334 | 1.176 |
| 1335 | 1.124 |
| 1336 | 1.155 |
| 1337 | 1.145 |
| 1338 | 1.193 |
| 1339 | 1.153 |
| 1340 | 1.147 |
| 1341 | 1.164 |
| 1342 | 1.179 |
| 1343 | 1.137 |
| 1344 | 1.174 |
| 1345 | 1.158 |
| 1346 | 1.14 |
| 1347 | 1.152 |
| 1348 | 1.159 |
| 1349 | 1.172 |
| 1350 | 1.159 |
| 1351 | 1.145 |
| 1352 | 1.108 |
| 1353 | 1.098 |
| 1354 | 1.173 |
| 1355 | 1.11 |
| 1356 | 1.146 |
| 1357 | 1.085 |
| 1358 | 1.125 |
| 1359 | 1.089 |
| 1360 | 1.142 |
| 1361 | 1.136 |
| 1362 | 1.094 |
| 1363 | 1.128 |
| 1364 | 1.133 |
| 1365 | 1.1 |
| 1366 | 1.094 |
| 1367 | 1.143 |
| 1368 | 1.139 |
| 1369 | 1.126 |
| 1370 | 1.157 |
| 1371 | 1.113 |
| 1372 | 1.133 |
| 1373 | 1.196 |
| 1374 | 1.186 |
| 1375 | 1.19 |
| 1376 | 1.201 |
| 1377 | 1.173 |
| 1378 | 1.192 |
| 1379 | 1.228 |
| 1380 | 1.224 |
| 1381 | 1.258 |
| 1382 | 1.246 |
| 1383 | 1.27 |
| 1384 | 1.225 |
| 1385 | 1.229 |
| 1386 | 1.206 |
| 1387 | 1.249 |
| 1388 | 1.276 |
| 1389 | 1.323 |
| 1390 | 1.276 |
| 1391 | 1.286 |
| 1392 | 1.279 |
| 1393 | 1.271 |
| 1394 | 1.252 |
| 1395 | 1.289 |
| 1396 | 1.309 |
| 1397 | 1.32 |
| 1398 | 1.309 |
| 1399 | 1.312 |
| 1400 | 1.319 |
| 1401 | 1.299 |
| 1402 | 1.313 |
| 1403 | 1.3 |
| 1404 | 1.333 |
| 1405 | 1.297 |
| 1406 | 1.273 |
| 1407 | 1.319 |
| 1408 | 1.298 |
| 1409 | 1.281 |
| 1410 | 1.305 |
| 1411 | 1.36 |
| 1412 | 1.263 |
| 1413 | 1.243 |
| 1414 | 1.282 |
| 1415 | 1.238 |
| 1416 | 1.242 |
| 1417 | 1.263 |
| 1418 | 1.219 |
| 1419 | 1.234 |
| 1420 | 1.224 |
| 1421 | 1.219 |
| 1422 | 1.218 |
| 1423 | 1.242 |
| 1424 | 1.224 |
| 1425 | 1.211 |
| 1426 | 1.226 |
| 1427 | 1.234 |
| 1428 | 1.225 |
| 1429 | 1.196 |
| 1430 | 1.178 |
| 1431 | 1.19 |
| 1432 | 1.172 |
| 1433 | 1.218 |
| 1434 | 1.177 |
| 1435 | 1.144 |
| 1436 | 1.169 |
| 1437 | 1.184 |
| 1438 | 1.13 |
| 1439 | 1.173 |
| 1440 | 1.16 |
| 1441 | 1.149 |
| 1442 | 1.141 |
| 1443 | 1.151 |
| 1444 | 1.09 |
| 1445 | 1.127 |
| 1446 | 1.095 |
| 1447 | 1.098 |
| 1448 | 1.093 |
| 1449 | 1.138 |
| 1450 | 1.089 |
| 1451 | 1.092 |
| 1452 | 1.071 |
| 1453 | 1.111 |
| 1454 | 1.098 |
| 1455 | 1.094 |
| 1456 | 1.062 |
| 1457 | 1.101 |
| 1458 | 1.087 |
| 1459 | 1.104 |
| 1460 | 1.093 |
| 1461 | 1.071 |
| 1462 | 1.116 |
| 1463 | 1.137 |
| 1464 | 1.135 |
| 1465 | 1.11 |
| 1466 | 1.11 |
| 1467 | 1.142 |
| 1468 | 1.128 |
| 1469 | 1.167 |
| 1470 | 1.12 |
| 1471 | 1.144 |
| 1472 | 1.142 |
| 1473 | 1.129 |
| 1474 | 1.129 |
| 1475 | 1.163 |
| 1476 | 1.136 |
| 1477 | 1.155 |
| 1478 | 1.165 |
| 1479 | 1.133 |
| 1480 | 1.167 |
| 1481 | 1.161 |
| 1482 | 1.164 |
| 1483 | 1.177 |
| 1484 | 1.156 |
| 1485 | 1.164 |
| 1486 | 1.155 |
| 1487 | 1.184 |
| 1488 | 1.179 |
| 1489 | 1.163 |
| 1490 | 1.157 |
| 1491 | 1.183 |
| 1492 | 1.194 |
| 1493 | 1.152 |
| 1494 | 1.138 |
| 1495 | 1.174 |
| 1496 | 1.165 |
| 1497 | 1.162 |
| 1498 | 1.15 |
| 1499 | 1.145 |
| 1500 | 1.165 |
| 1501 | 1.17 |
| 1502 | 1.17 |
| 1503 | 1.171 |
| 1504 | 1.176 |
| 1505 | 1.164 |
| 1506 | 1.174 |
| 1507 | 1.179 |
| 1508 | 1.196 |
| 1509 | 1.183 |
| 1510 | 1.19 |
| 1511 | 1.153 |
| 1512 | 1.212 |
| 1513 | 1.216 |
| 1514 | 1.233 |
| 1515 | 1.193 |
| 1516 | 1.214 |
| 1517 | 1.21 |
| 1518 | 1.196 |
| 1519 | 1.265 |
| 1520 | 1.242 |
| 1521 | 1.199 |
| 1522 | 1.212 |
| 1523 | 1.258 |
| 1524 | 1.232 |
| 1525 | 1.271 |
| 1526 | 1.225 |
| 1527 | 1.228 |
| 1528 | 1.226 |
| 1529 | 1.208 |
| 1530 | 1.24 |
| 1531 | 1.225 |
| 1532 | 1.224 |
| 1533 | 1.207 |
| 1534 | 1.21 |
| 1535 | 1.227 |
| 1536 | 1.237 |
| 1537 | 1.213 |
| 1538 | 1.218 |
| 1539 | 1.15 |
| 1540 | 1.248 |
| 1541 | 1.232 |
| 1542 | 1.228 |
| 1543 | 1.198 |
| 1544 | 1.292 |
| 1545 | 1.212 |
| 1546 | 1.254 |
| 1547 | 1.215 |
| 1548 | 1.187 |
| 1549 | 1.222 |
| 1550 | 1.212 |
| 1551 | 1.158 |
| 1552 | 1.225 |
| 1553 | 1.23 |
| 1554 | 1.234 |
| 1555 | 1.234 |
| 1556 | 1.263 |
| 1557 | 1.235 |
| 1558 | 1.265 |
| 1559 | 1.207 |
| 1560 | 1.197 |
| 1561 | 1.211 |
| 1562 | 1.224 |
| 1563 | 1.208 |
| 1564 | 1.209 |
| 1565 | 1.199 |
| 1566 | 1.218 |
| 1567 | 1.202 |
| 1568 | 1.224 |
| 1569 | 1.214 |
| 1570 | 1.08 |
| 1571 | 1.171 |
| 1572 | 1.168 |
| 1573 | 1.202 |
| 1574 | 1.18 |
| 1575 | 1.193 |
| 1576 | 1.212 |
| 1577 | 1.15 |
| 1578 | 1.208 |
| 1579 | 1.185 |
| 1580 | 1.159 |
| 1581 | 1.157 |
| 1582 | 1.171 |
| 1583 | 1.116 |
| 1584 | 1.214 |
| 1585 | 1.183 |
| 1586 | 1.214 |
| 1587 | 1.2 |
| 1588 | 1.213 |
| 1589 | 1.172 |
| 1590 | 1.178 |
| 1591 | 1.229 |
| 1592 | 1.197 |
| 1593 | 1.274 |
| 1594 | 1.236 |
| 1595 | 1.298 |
| 1596 | 1.166 |
| 1597 | 1.258 |
| 1598 | 1.244 |
| 1599 | 1.174 |
| 1600 | 1.245 |
| 1601 | 1.249 |
| 1602 | 1.263 |
| 1603 | 1.236 |
| 1604 | 1.187 |
| 1605 | 1.205 |
| 1606 | 1.234 |
| 1607 | 1.227 |
| 1608 | 1.16 |
| 1609 | 1.208 |
| 1610 | 1.24 |
| 1611 | 1.281 |
| 1612 | 1.193 |
| 1613 | 1.16 |
| 1614 | 1.275 |
| 1615 | 1.187 |
| 1616 | 1.195 |
| 1617 | 1.225 |
| 1618 | 1.245 |
| 1619 | 1.258 |
| 1620 | 1.1 |
| 1621 | 1.216 |
| 1622 | 1.225 |
| 1623 | 1.222 |
| 1624 | 1.191 |
| 1625 | 1.199 |
| 1626 | 1.234 |
| 1627 | 1.193 |
| 1628 | 1.215 |
| 1629 | 1.127 |
| 1630 | 1.157 |
| 1631 | 1.144 |
| 1632 | 1.145 |
| 1633 | 1.162 |
| 1634 | 1.083 |
| 1635 | 1.161 |
| 1636 | 1.086 |
| 1637 | 1.134 |
| 1638 | 1.123 |
| 1639 | 1.117 |
| 1640 | 1.137 |
| 1641 | 1.042 |
| 1642 | 1.051 |
| 1643 | 1.048 |
| 1644 | 1.067 |
| 1645 | 1.091 |
| 1646 | 1.095 |
| 1647 | 1.096 |
| 1648 | 1.082 |
| 1649 | 1.072 |
| 1650 | 1.126 |
| 1651 | 1.09 |
| 1652 | 1.195 |
| 1653 | 1.089 |
| 1654 | 1.102 |
| 1655 | 1.127 |
| 1656 | 1.089 |
| 1657 | 1.082 |
| 1658 | 1.106 |
| 1659 | 1.12 |
| 1660 | 1.126 |
| 1661 | 1.133 |
| 1662 | 1.171 |
| 1663 | 1.122 |
| 1664 | 1.132 |
| 1665 | 1.115 |
| 1666 | 1.112 |
| 1667 | 1.126 |
| 1668 | 1.112 |
| 1669 | 1.124 |
| 1670 | 1.152 |
| 1671 | 1.102 |
| 1672 | 1.131 |
| 1673 | 1.14 |
| 1674 | 1.098 |
| 1675 | 1.089 |
| 1676 | 1.152 |
| 1677 | 1.072 |
| 1678 | 1.083 |
| 1679 | 1.059 |
| 1680 | 1.133 |
| 1681 | 1.097 |
| 1682 | 1.097 |
| 1683 | 1.136 |
| 1684 | 1.118 |
| 1685 | 1.103 |
| 1686 | 1.083 |
| 1687 | 1.077 |
| 1688 | 1.115 |
| 1689 | 1.145 |
| 1690 | 1.129 |
| 1691 | 1.127 |
| 1692 | 1.115 |
| 1693 | 1.103 |
| 1694 | 1.111 |
| 1695 | 1.111 |
| 1696 | 1.105 |
| 1697 | 1.11 |
| 1698 | 1.11 |
| 1699 | 1.111 |
| 1700 | 1.094 |
| 1701 | 1.111 |
| 1702 | 1.154 |
| 1703 | 1.142 |
| 1704 | 1.109 |
| 1705 | 1.114 |
| 1706 | 1.119 |
| 1707 | 1.114 |
| 1708 | 1.11 |
| 1709 | 1.044 |
| 1710 | 1.093 |
| 1711 | 1.121 |
| 1712 | 1.111 |
| 1713 | 1.035 |
| 1714 | 1.131 |
| 1715 | 1.054 |
| 1716 | 1.08 |
| 1717 | 1.141 |
| 1718 | 1.05 |
| 1719 | 1.092 |
| 1720 | 1.126 |
| 1721 | 1.081 |
| 1722 | 1.072 |
| 1723 | 1.084 |
| 1724 | 1.048 |
| 1725 | 1.057 |
| 1726 | 1.09 |
| 1727 | 1.111 |
| 1728 | 1.092 |
| 1729 | 1.12 |
| 1730 | 1.061 |
| 1731 | 1.066 |
| 1732 | 1.074 |
| 1733 | 1.039 |
| 1734 | 1.032 |
| 1735 | 1.029 |
| 1736 | 1.098 |
| 1737 | 1.101 |
| 1738 | 1.065 |
| 1739 | 0.992 |
| 1740 | 1.113 |
| 1741 | 1.063 |
| 1742 | 1.027 |
| 1743 | 1.092 |
| 1744 | 1.064 |
| 1745 | 1.08 |
| 1746 | 1.049 |
| 1747 | 1.149 |
| 1748 | 1.059 |
| 1749 | 1.097 |
| 1750 | 1.086 |
| 1751 | 1.078 |
| 1752 | 1.149 |
| 1753 | 1.104 |
| 1754 | 1.132 |
| 1755 | 1.103 |
| 1756 | 1.091 |
| 1757 | 1.177 |
| 1758 | 1.141 |
| 1759 | 1.103 |
| 1760 | 1.078 |
| 1761 | 1.09 |
| 1762 | 1.107 |
| 1763 | 1.102 |
| 1764 | 1.088 |
| 1765 | 1.108 |
| 1766 | 1.098 |
| 1767 | 1.072 |
| 1768 | 1.184 |
| 1769 | 1.108 |
| 1770 | 1.162 |
| 1771 | 1.114 |
| 1772 | 1.123 |
| 1773 | 1.109 |
| 1774 | 1.084 |
| 1775 | 1.155 |
| 1776 | 1.207 |
| 1777 | 1.161 |
| 1778 | 1.151 |
| 1779 | 1.139 |
| 1780 | 1.15 |
| 1781 | 1.092 |
| 1782 | 1.141 |
| 1783 | 1.14 |
| 1784 | 1.142 |
| 1785 | 1.098 |
| 1786 | 1.153 |
| 1787 | 1.225 |
| 1788 | 1.126 |
| 1789 | 1.195 |
| 1790 | 1.192 |
| 1791 | 1.213 |
| 1792 | 1.21 |
| 1793 | 1.148 |
| 1794 | 1.215 |
| 1795 | 1.067 |
| 1796 | 1.131 |
| 1797 | 1.148 |
| 1798 | 1.135 |
| 1799 | 1.152 |
| 1800 | 1.077 |
| 1801 | 1.106 |
| 1802 | 1.217 |
| 1803 | 1.124 |
| 1804 | 1.153 |
| 1805 | 1.131 |
| 1806 | 1.112 |
| 1807 | 1.127 |
| 1808 | 1.109 |
| 1809 | 1.121 |
| 1810 | 1.134 |
| 1811 | 1.12 |
| 1812 | 1.11 |
| 1813 | 1.194 |
| 1814 | 1.12 |
| 1815 | 1.132 |
| 1816 | 1.175 |
| 1817 | 1.158 |
| 1818 | 1.142 |
| 1819 | 1.167 |
| 1820 | 1.195 |
| 1821 | 1.22 |
| 1822 | 1.191 |
| 1823 | 1.16 |
| 1824 | 1.196 |
| 1825 | 1.218 |
| 1826 | 1.179 |
| 1827 | 1.207 |
| 1828 | 1.199 |
| 1829 | 1.223 |
| 1830 | 1.232 |
| 1831 | 1.246 |
| 1832 | 1.209 |
| 1833 | 1.202 |
| 1834 | 1.222 |
| 1835 | 1.236 |
| 1836 | 1.25 |
| 1837 | 1.229 |
| 1838 | 1.256 |
| 1839 | 1.247 |
| 1840 | 1.294 |
| 1841 | 1.259 |
| 1842 | 1.275 |
| 1843 | 1.215 |
| 1844 | 1.241 |
| 1845 | 1.304 |
| 1846 | 1.202 |
| 1847 | 1.164 |
| 1848 | 1.37 |
| 1849 | 1.211 |
| 1850 | 1.226 |
| 1851 | 1.325 |
| 1852 | 1.153 |
| 1853 | 1.222 |
| 1854 | 1.271 |
| 1855 | 1.185 |
| 1856 | 1.173 |
| 1857 | 1.232 |
| 1858 | 1.233 |
| 1859 | 1.227 |
| 1860 | 1.193 |
| 1861 | 1.212 |
| 1862 | 1.265 |
| 1863 | 1.244 |
| 1864 | 1.218 |
| 1865 | 1.235 |
| 1866 | 1.249 |
| 1867 | 1.188 |
| 1868 | 1.256 |
| 1869 | 1.188 |
| 1870 | 1.223 |
| 1871 | 1.226 |
| 1872 | 1.273 |
| 1873 | 1.258 |
| 1874 | 1.231 |
| 1875 | 1.257 |
| 1876 | 1.266 |
| 1877 | 1.294 |
| 1878 | 1.221 |
| 1879 | 1.232 |
| 1880 | 1.236 |
| 1881 | 1.29 |
| 1882 | 1.3 |
| 1883 | 1.263 |
| 1884 | 1.291 |
| 1885 | 1.172 |
| 1886 | 1.296 |
| 1887 | 1.253 |
| 1888 | 1.415 |
| 1889 | 1.328 |
| 1890 | 1.277 |
| 1891 | 1.341 |
| 1892 | 1.234 |
| 1893 | 1.28 |
| 1894 | 1.401 |
| 1895 | 1.324 |
| 1896 | 1.305 |
| 1897 | 1.285 |
| 1898 | 1.362 |
| 1899 | 1.221 |
| 1900 | 1.37 |
| 1901 | 1.375 |
| 1902 | 1.33 |
| 1903 | 1.416 |
| 1904 | 1.338 |
| 1905 | 1.253 |
| 1906 | 1.345 |
| 1907 | 1.307 |
| 1908 | 1.399 |
| 1909 | 1.376 |
| 1910 | 1.299 |
| 1911 | 1.318 |
| 1912 | 1.274 |
| 1913 | 1.181 |
| 1914 | 1.329 |
| 1915 | 1.195 |
| 1916 | 1.152 |
| 1917 | 1.251 |
| 1918 | 1.216 |
| 1919 | 1.21 |
| 1920 | 1.216 |
| 1921 | 1.264 |
| 1922 | 1.207 |
| 1923 | 1.275 |
| 1924 | 1.161 |
| 1925 | 1.216 |
| 1926 | 1.223 |
| 1927 | 1.172 |
| 1928 | 1.161 |
| 1929 | 1.192 |
| 1930 | 1.158 |
| 1931 | 1.182 |
| 1932 | 1.126 |
| 1933 | 1.192 |
| 1934 | 1.095 |
| 1935 | 1.235 |
| 1936 | 1.138 |
| 1937 | 1.16 |
| 1938 | 1.067 |
| 1939 | 1.125 |
| 1940 | 1.066 |
| 1941 | 1.154 |
| 1942 | 1.125 |
| 1943 | 1.103 |
| 1944 | 1.15 |
| 1945 | 1.18 |
| 1946 | 1.132 |
| 1947 | 1.166 |
| 1948 | 1.101 |
| 1949 | 1.121 |
| 1950 | 1.254 |
| 1951 | 1.238 |
| 1952 | 1.231 |
| 1953 | 1.239 |
| 1954 | 1.229 |
| 1955 | 1.272 |
| 1956 | 1.258 |
| 1957 | 1.42 |
| 1958 | 1.202 |
| 1959 | 1.266 |
| 1960 | 1.288 |
| 1961 | 1.203 |
| 1962 | 1.312 |
| 1963 | 1.484 |
| 1964 | 1.296 |
| 1965 | 1.345 |
| 1966 | 1.295 |
| 1967 | 1.307 |
| 1968 | 1.412 |
| 1969 | 1.145 |
| 1970 | 1.078 |
| 1971 | 1.377 |
| 1972 | 1.385 |
| 1973 | 1.288 |
| 1974 | 1.263 |
| 1975 | 1.286 |
| 1976 | 1.38 |
| 1977 | 1.301 |
| 1978 | 1.297 |
| 1979 | 1.364 |
| 1980 | 1.426 |
| 1981 | 1.532 |
| 1982 | 1.371 |
| 1983 | 1.352 |
| 1984 | 1.374 |
| 1985 | 1.497 |
| 1986 | 1.398 |
| 1987 | 1.356 |
| 1988 | 1.448 |
| 1989 | 1.428 |
| 1990 | 1.337 |
| 1991 | 1.474 |
| 1992 | 1.424 |
| 1993 | 1.379 |
| 1994 | 1.348 |
| 1995 | 1.483 |
| 1996 | 1.369 |
| 1997 | 1.298 |
| 1998 | 1.412 |
| 1999 | 1.298 |
| 2000 | 1.338 |
| 2001 | 1.356 |
| 2002 | 1.337 |
| 2003 | 1.356 |
| 2004 | 1.36 |
| 2005 | 1.322 |
| 2006 | 1.365 |
| 2007 | 1.37 |
| 2008 | 1.459 |
| 2009 | 1.226 |
| 2010 | 1.351 |
| 2011 | 1.359 |
| 2012 | 1.454 |
| 2013 | 1.294 |
| 2014 | 1.365 |
| 2015 | 1.393 |
| 2016 | 1.344 |
| 2017 | 1.347 |
| 2018 | 1.59 |
| 2019 | 1.428 |
| 2020 | 1.39 |
| 2021 | 1.338 |
| 2022 | 1.407 |
| 2023 | 1.403 |
| 2024 | 1.507 |
| 2025 | 1.33 |
| 2026 | 1.363 |
| 2027 | 1.427 |
| 2028 | 1.428 |
| 2029 | 1.442 |
| 2030 | 1.392 |
| 2031 | 1.485 |
| 2032 | 1.423 |
| 2033 | 1.491 |
| 2034 | 1.344 |
| 2035 | 1.344 |
| 2036 | 1.391 |
| 2037 | 1.384 |
| 2038 | 1.405 |
| 2039 | 1.427 |
| 2040 | 1.429 |
| 2041 | 1.406 |
| 2042 | 1.529 |
| 2043 | 1.331 |
| 2044 | 1.357 |
| 2045 | 1.381 |
| 2046 | 1.421 |
| 2047 | 1.501 |
| 2048 | 1.506 |
| 2049 | 1.41 |
| 2050 | 1.397 |
| 2051 | 1.348 |
| 2052 | 1.355 |
| 2053 | 1.44 |
| 2054 | 1.37 |
| 2055 | 1.456 |
| 2056 | 1.488 |
| 2057 | 1.449 |
| 2058 | 1.364 |
| 2059 | 1.363 |
| 2060 | 1.375 |
| 2061 | 1.384 |
| 2062 | 1.504 |
| 2063 | 1.354 |
| 2064 | 1.438 |
| 2065 | 1.386 |
| 2066 | 1.273 |
| 2067 | 1.559 |
| 2068 | 1.372 |
| 2069 | 1.357 |
| 2070 | 1.428 |
| 2071 | 1.458 |
| 2072 | 1.582 |
| 2073 | 1.511 |
| 2074 | 1.387 |
| 2075 | 1.315 |
| 2076 | 1.432 |
| 2077 | 1.393 |
| 2078 | 1.435 |
| 2079 | 1.303 |
| 2080 | 1.322 |
| 2081 | 1.579 |
| 2082 | 1.399 |
| 2083 | 1.497 |
| 2084 | 1.444 |
| 2085 | 1.408 |
| 2086 | 1.488 |
| 2087 | 1.454 |
| 2088 | 1.497 |
| 2089 | 1.445 |
| 2090 | 1.349 |
| 2091 | 1.576 |
| 2092 | 1.441 |
| 2093 | 1.6 |
| 2094 | 1.47 |
| 2095 | 1.439 |
| 2096 | 1.487 |
| 2097 | 1.572 |
| 2098 | 1.632 |
| 2099 | 1.463 |
| 2100 | 1.529 |
| 2101 | 1.515 |
| 2102 | 1.537 |
| 2103 | 1.614 |
| 2104 | 1.634 |
| 2105 | 1.591 |
| 2106 | 1.591 |
| 2107 | 1.618 |
| 2108 | 1.596 |
| 2109 | 1.428 |
| 2110 | 1.565 |
| 2111 | 1.809 |
| 2112 | 1.649 |
| 2113 | 1.639 |
| 2114 | 1.552 |
| 2115 | 1.555 |
| 2116 | 1.942 |
| 2117 | 1.683 |
| 2118 | 1.467 |
| 2119 | 1.617 |
| 2120 | 1.547 |
| 2121 | 1.545 |
| 2122 | 1.511 |
| 2123 | 1.528 |
| 2124 | 1.691 |
| 2125 | 1.589 |
| 2126 | 1.484 |
| 2127 | 1.494 |
| 2128 | 1.584 |
| 2129 | 1.569 |
| 2130 | 1.467 |
| 2131 | 1.518 |
| 2132 | 1.606 |
| 2133 | 1.53 |
| 2134 | 1.533 |
| 2135 | 1.59 |
| 2136 | 1.611 |
| 2137 | 1.638 |
| 2138 | 1.545 |
| 2139 | 1.532 |
| 2140 | 1.524 |
| 2141 | 1.522 |
| 2142 | 1.461 |
| 2143 | 1.626 |
| 2144 | 1.68 |
| 2145 | 1.482 |
| 2146 | 1.589 |
| 2147 | 1.638 |
| 2148 | 1.513 |
| 2149 | 1.507 |
| 2150 | 1.671 |
| 2151 | 1.543 |
| 2152 | 1.458 |
| 2153 | 1.455 |
| 2154 | 1.571 |
| 2155 | 1.524 |
| 2156 | 1.503 |
| 2157 | 1.599 |
| 2158 | 1.494 |
| 2159 | 1.489 |
| 2160 | 1.512 |
| 2161 | 1.403 |
| 2162 | 1.463 |
| 2163 | 1.511 |
| 2164 | 1.385 |
| 2165 | 1.442 |
| 2166 | 1.459 |
| 2167 | 1.516 |
| 2168 | 1.468 |
| 2169 | 1.413 |
| 2170 | 1.295 |
| 2171 | 1.395 |
| 2172 | 1.363 |
| 2173 | 1.336 |
| 2174 | 1.357 |
| 2175 | 1.303 |
| 2176 | 1.346 |
| 2177 | 1.436 |
| 2178 | 1.388 |
| 2179 | 1.424 |
| 2180 | 1.327 |
| 2181 | 1.385 |
| 2182 | 1.384 |
| 2183 | 1.341 |
| 2184 | 1.452 |
| 2185 | 1.408 |
| 2186 | 1.37 |
| 2187 | 1.329 |
| 2188 | 1.441 |
| 2189 | 1.436 |
| 2190 | 1.411 |
| 2191 | 1.454 |
| 2192 | 1.436 |
| 2193 | 1.448 |
| 2194 | 1.467 |
| 2195 | 1.409 |
| 2196 | 1.426 |
| 2197 | 1.42 |
| 2198 | 1.426 |
| 2199 | 1.421 |
| 2200 | 1.508 |
| 2201 | 1.428 |
| 2202 | 1.337 |
| 2203 | 1.427 |
| 2204 | 1.421 |
| 2205 | 1.404 |
| 2206 | 1.347 |
| 2207 | 1.394 |
| 2208 | 1.475 |
| 2209 | 1.374 |
| 2210 | 1.388 |
| 2211 | 1.363 |
| 2212 | 1.368 |
| 2213 | 1.303 |
| 2214 | 1.372 |
| 2215 | 1.367 |
| 2216 | 1.307 |
| 2217 | 1.3 |
| 2218 | 1.321 |
| 2219 | 1.213 |
| 2220 | 1.278 |
| 2221 | 1.404 |
| 2222 | 1.3 |
| 2223 | 1.318 |
| 2224 | 1.255 |
| 2225 | 1.258 |
| 2226 | 1.259 |
| 2227 | 1.279 |
| 2228 | 1.34 |
| 2229 | 1.304 |
| 2230 | 1.342 |
| 2231 | 1.249 |
| 2232 | 1.248 |
| 2233 | 1.32 |
| 2234 | 1.281 |
| 2235 | 1.247 |
| 2236 | 1.271 |
| 2237 | 1.32 |
| 2238 | 1.301 |
| 2239 | 1.324 |
| 2240 | 1.305 |
| 2241 | 1.336 |
| 2242 | 1.352 |
| 2243 | 1.331 |
| 2244 | 1.316 |
| 2245 | 1.331 |
| 2246 | 1.414 |
| 2247 | 1.349 |
| 2248 | 1.391 |
| 2249 | 1.33 |
| 2250 | 1.359 |
| 2251 | 1.394 |
| 2252 | 1.334 |
| 2253 | 1.375 |
| 2254 | 1.342 |
| 2255 | 1.321 |
| 2256 | 1.418 |
| 2257 | 1.35 |
| 2258 | 1.357 |
| 2259 | 1.304 |
| 2260 | 1.32 |
| 2261 | 1.302 |
| 2262 | 1.325 |
| 2263 | 1.255 |
| 2264 | 1.287 |
| 2265 | 1.188 |
| 2266 | 1.31 |
| 2267 | 1.255 |
| 2268 | 1.26 |
| 2269 | 1.282 |
| 2270 | 1.216 |
| 2271 | 1.132 |
| 2272 | 1.245 |
| 2273 | 1.246 |
| 2274 | 1.21 |
| 2275 | 1.209 |
| 2276 | 1.232 |
| 2277 | 1.208 |
| 2278 | 1.239 |
| 2279 | 1.234 |
| 2280 | 1.228 |
| 2281 | 1.277 |
| 2282 | 1.177 |
| 2283 | 1.18 |
| 2284 | 1.203 |
| 2285 | 1.186 |
| 2286 | 1.277 |
| 2287 | 1.219 |
| 2288 | 1.22 |
| 2289 | 1.192 |
| 2290 | 1.211 |
| 2291 | 1.118 |
| 2292 | 1.191 |
| 2293 | 1.194 |
| 2294 | 1.16 |
| 2295 | 1.11 |
| 2296 | 1.25 |
| 2297 | 1.126 |
| 2298 | 1.163 |
| 2299 | 1.14 |
| 2300 | 1.159 |
| 2301 | 1.115 |
| 2302 | 1.141 |
| 2303 | 1.142 |
| 2304 | 1.153 |
| 2305 | 1.126 |
| 2306 | 1.139 |
| 2307 | 1.132 |
| 2308 | 1.115 |
| 2309 | 1.1 |
| 2310 | 1.126 |
| 2311 | 1.114 |
| 2312 | 1.14 |
| 2313 | 1.065 |
| 2314 | 1.147 |
| 2315 | 1.17 |
| 2316 | 1.142 |
| 2317 | 1.086 |
| 2318 | 1.121 |
| 2319 | 1.12 |
| 2320 | 1.089 |
| 2321 | 1.097 |
| 2322 | 1.099 |
| 2323 | 1.186 |
| 2324 | 1.136 |
| 2325 | 1.098 |
| 2326 | 1.083 |
| 2327 | 1.15 |
| 2328 | 1.108 |
| 2329 | 1.095 |
| 2330 | 1.136 |
| 2331 | 1.108 |
| 2332 | 1.134 |
| 2333 | 1.065 |
| 2334 | 1.162 |
| 2335 | 1.136 |
| 2336 | 1.089 |
| 2337 | 1.094 |
| 2338 | 1.082 |
| 2339 | 1.089 |
| 2340 | 1.099 |
| 2341 | 1.107 |
| 2342 | 1.103 |
| 2343 | 1.118 |
| 2344 | 1.133 |
| 2345 | 1.139 |
| 2346 | 1.121 |
| 2347 | 1.118 |
| 2348 | 1.155 |
| 2349 | 1.115 |
| 2350 | 1.153 |
| 2351 | 1.137 |
| 2352 | 1.186 |
| 2353 | 1.159 |
| 2354 | 1.121 |
| 2355 | 1.145 |
| 2356 | 1.167 |
| 2357 | 1.138 |
| 2358 | 1.153 |
| 2359 | 1.155 |
| 2360 | 1.171 |
| 2361 | 1.133 |
| 2362 | 1.182 |
| 2363 | 1.172 |
| 2364 | 1.142 |
| 2365 | 1.161 |
| 2366 | 1.16 |
| 2367 | 1.171 |
| 2368 | 1.182 |
| 2369 | 1.195 |
| 2370 | 1.169 |
| 2371 | 1.202 |
| 2372 | 1.194 |
| 2373 | 1.196 |
| 2374 | 1.175 |
| 2375 | 1.195 |
| 2376 | 1.231 |
| 2377 | 1.165 |
| 2378 | 1.193 |
| 2379 | 1.214 |
| 2380 | 1.193 |
| 2381 | 1.181 |
| 2382 | 1.17 |
| 2383 | 1.199 |
| 2384 | 1.197 |
| 2385 | 1.203 |
| 2386 | 1.197 |
| 2387 | 1.258 |
| 2388 | 1.213 |
| 2389 | 1.202 |
| 2390 | 1.178 |
| 2391 | 1.181 |
| 2392 | 1.222 |
| 2393 | 1.178 |
| 2394 | 1.17 |
| 2395 | 1.234 |
| 2396 | 1.215 |
| 2397 | 1.21 |
| 2398 | 1.212 |
| 2399 | 1.206 |
| 2400 | 1.196 |
| 2401 | 1.208 |
| 2402 | 1.211 |
| 2403 | 1.209 |
| 2404 | 1.203 |
| 2405 | 1.29 |
| 2406 | 1.208 |
| 2407 | 1.243 |
| 2408 | 1.215 |
| 2409 | 1.222 |
| 2410 | 1.292 |
| 2411 | 1.182 |
| 2412 | 1.226 |
| 2413 | 1.242 |
| 2414 | 1.284 |
| 2415 | 1.293 |
| 2416 | 1.185 |
| 2417 | 1.225 |
| 2418 | 1.286 |
| 2419 | 1.265 |
| 2420 | 1.259 |
| 2421 | 1.279 |
| 2422 | 1.243 |
| 2423 | 1.272 |
| 2424 | 1.262 |
| 2425 | 1.242 |
| 2426 | 1.242 |
| 2427 | 1.288 |
| 2428 | 1.298 |
| 2429 | 1.303 |
| 2430 | 1.199 |
| 2431 | 1.381 |
| 2432 | 1.249 |
| 2433 | 1.205 |
| 2434 | 1.274 |
| 2435 | 1.213 |
| 2436 | 1.231 |
| 2437 | 1.219 |
| 2438 | 1.221 |
| 2439 | 1.228 |
| 2440 | 1.252 |
| 2441 | 1.178 |
| 2442 | 1.208 |
| 2443 | 1.196 |
| 2444 | 1.146 |
| 2445 | 1.145 |
| 2446 | 1.207 |
| 2447 | 1.12 |
| 2448 | 1.141 |
| 2449 | 1.078 |
| 2450 | 1.274 |
| 2451 | 1.126 |
| 2452 | 1.083 |
| 2453 | 1.063 |
| 2454 | 1.125 |
| 2455 | 1.168 |
| 2456 | 1.21 |
| 2457 | 1.124 |
| 2458 | 1.101 |
| 2459 | 1.195 |
| 2460 | 1.147 |
| 2461 | 1.132 |
| 2462 | 1.191 |
| 2463 | 1.15 |
| 2464 | 1.158 |
| 2465 | 1.157 |
| 2466 | 1.124 |
| 2467 | 1.202 |
| 2468 | 1.125 |
| 2469 | 1.198 |
| 2470 | 1.243 |
| 2471 | 1.18 |
| 2472 | 1.209 |
| 2473 | 1.155 |
| 2474 | 1.224 |
| 2475 | 1.223 |
| 2476 | 1.219 |
| 2477 | 1.261 |
| 2478 | 1.216 |
| 2479 | 1.202 |
| 2480 | 1.189 |
| 2481 | 1.122 |
| 2482 | 1.221 |
| 2483 | 1.23 |
| 2484 | 1.194 |
| 2485 | 1.206 |
| 2486 | 1.163 |
| 2487 | 1.195 |
| 2488 | 1.356 |
| 2489 | 1.564 |
| 2490 | 1.167 |
| 2491 | 1.096 |
| 2492 | 1.247 |
| 2493 | 1.112 |
| 2494 | 1.16 |
| 2495 | 1.205 |
| 2496 | 1.205 |
| 2497 | 1.239 |
| 2498 | 1.156 |
| 2499 | 1.135 |
| 2500 | 1.237 |
| 2501 | 1.146 |
| 2502 | 1.198 |
| 2503 | 1.147 |
| 2504 | 1.217 |
| 2505 | 1.174 |
| 2506 | 1.271 |
| 2507 | 1.285 |
| 2508 | 1.172 |
| 2509 | 1.188 |
| 2510 | 1.203 |
| 2511 | 1.171 |
| 2512 | 1.064 |
| 2513 | 1.173 |
| 2514 | 1.253 |
| 2515 | 1.024 |
| 2516 | 1.136 |